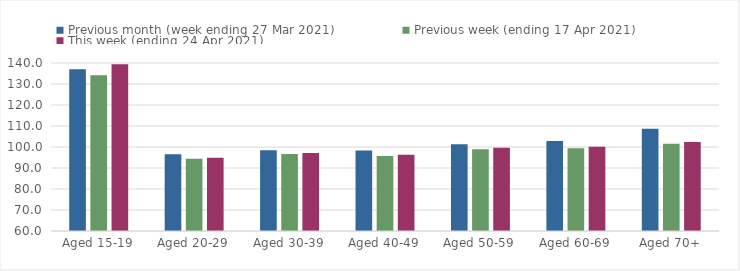
| Category | Previous month (week ending 27 Mar 2021) | Previous week (ending 17 Apr 2021) | This week (ending 24 Apr 2021) |
|---|---|---|---|
| Aged 15-19 | 136.98 | 134.13 | 139.45 |
| Aged 20-29 | 96.55 | 94.35 | 94.85 |
| Aged 30-39 | 98.42 | 96.66 | 97.09 |
| Aged 40-49 | 98.31 | 95.68 | 96.35 |
| Aged 50-59 | 101.28 | 98.96 | 99.6 |
| Aged 60-69 | 102.9 | 99.43 | 100.09 |
| Aged 70+ | 108.71 | 101.57 | 102.36 |